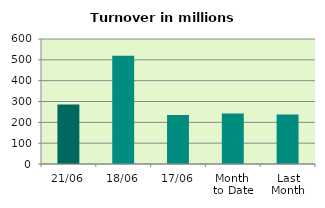
| Category | Series 0 |
|---|---|
| 21/06 | 285.998 |
| 18/06 | 519.245 |
| 17/06 | 234.878 |
| Month 
to Date | 241.859 |
| Last
Month | 237.894 |